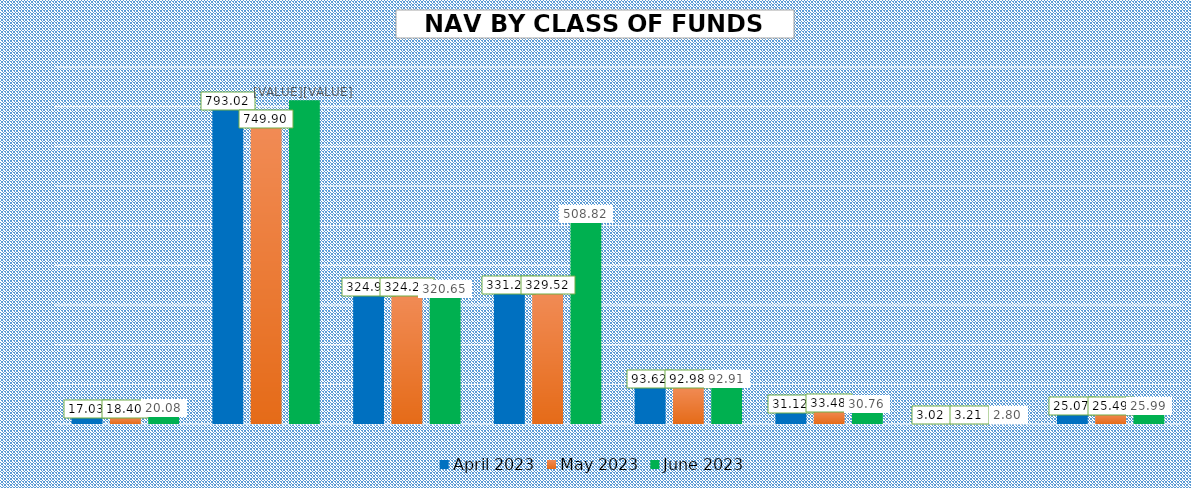
| Category | April 2023 | May 2023 | June 2023 |
|---|---|---|---|
| EQUITY BASED FUNDS | 17.026 | 18.396 | 20.084 |
| MONEY MARKET FUNDS | 793.022 | 749.901 | 816.072 |
| BONDS/FIXED INCOME FUNDS | 324.976 | 324.257 | 320.654 |
| DOLLAR FUNDS | 331.277 | 329.523 | 508.823 |
| REAL ESTATE INVESTMENT TRUST | 93.62 | 92.979 | 92.907 |
| BALANCED FUNDS | 31.12 | 33.484 | 30.762 |
| ETHICAL FUNDS | 3.019 | 3.211 | 2.8 |
| SHARI'AH COMPLAINT FUNDS | 25.071 | 25.486 | 25.988 |